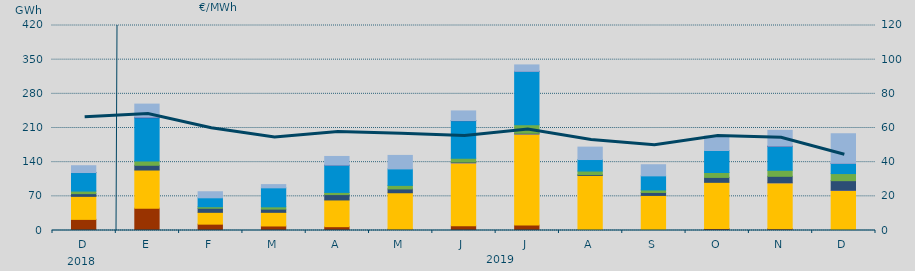
| Category | Carbón | Ciclo Combinado | Cogeneración | Consumo Bombeo | Eólica | Hidráulica | Nuclear | Otras Renovables | Solar fotovoltaica | Turbinación bombeo |
|---|---|---|---|---|---|---|---|---|---|---|
| D | 22754.1 | 47185.3 | 0 | 5564.6 | 5249.4 | 37928.6 | 81 | 0 | 0 | 13945.1 |
| E | 45764.1 | 78136.9 | 0 | 9703.8 | 8718.7 | 88684.7 | 1159.3 | 0 | 0 | 26791.4 |
| F | 13008.4 | 24231.2 | 0 | 8329.6 | 3127.4 | 18281.1 | 0 | 0 | 0 | 12422.8 |
| M | 9261.4 | 27952 | 0 | 6580.9 | 4696.4 | 38895.4 | 0 | 0 | 0 | 6656.1 |
| A | 7813.1 | 54755.9 | 0 | 11010.9 | 4506.1 | 55784.8 | 149.4 | 0 | 0 | 17672.7 |
| M | 2747.5 | 74607.7 | 0 | 7818.6 | 7248.2 | 33753.6 | 0 | 0 | 0 | 27655 |
| J | 9630 | 128693.8 | 467.1 | 1487.8 | 7835.7 | 76799.4 | 366 | 20 | 0 | 19680.5 |
| J | 11017.4 | 186524.2 | 300.4 | 1392.5 | 17639.5 | 109155.5 | 60 | 0 | 0 | 13153.1 |
| A | 1459.4 | 111215 | 0 | 1733.4 | 7402.2 | 23588.2 | 0 | 0 | 0 | 25429.5 |
| S | 311.6 | 71523.4 | 0 | 6112.7 | 5081.7 | 28895.9 | 0 | 0 | 0 | 22840.2 |
| O | 4163.7 | 94511.7 | 0 | 10093.2 | 10069.8 | 45049.8 | 0 | 0 | 0 | 29699 |
| N | 3677.8 | 93991.4 | 51.5 | 13298.4 | 12383 | 48971.8 | 539 | 0 | 0 | 32260 |
| D | 1607.3 | 80390.7 | 371.4 | 19733.1 | 14568.3 | 20541.3 | 876.4 | 0 | 1.2 | 60128.2 |